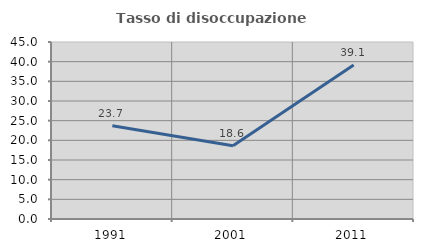
| Category | Tasso di disoccupazione giovanile  |
|---|---|
| 1991.0 | 23.729 |
| 2001.0 | 18.605 |
| 2011.0 | 39.13 |